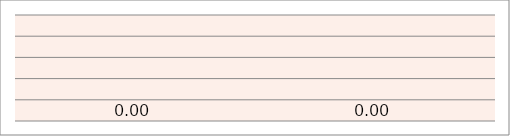
| Category | Series 1 |
|---|---|
| 0 | 0 |
| 1 | 0 |